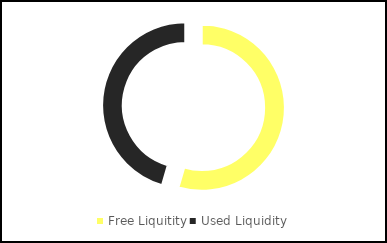
| Category | Series 0 |
|---|---|
| Free Liquitity | 0.419 |
| Used Liquidity | 0.35 |